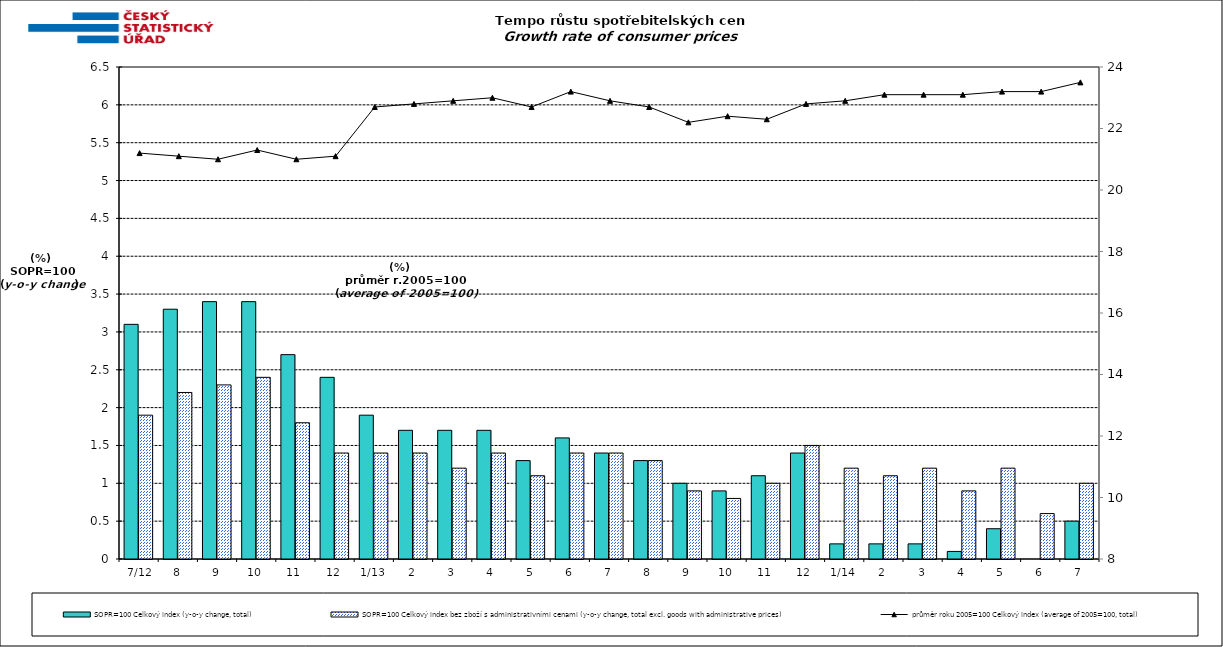
| Category | SOPR=100 Celkový index (y-o-y change, total) | SOPR=100 Celkový index bez zboží s administrativními cenami (y-o-y change, total excl. goods with administrative prices)  |
|---|---|---|
|  7/12 | 3.1 | 1.9 |
| 8 | 3.3 | 2.2 |
| 9 | 3.4 | 2.3 |
| 10 | 3.4 | 2.4 |
| 11 | 2.7 | 1.8 |
| 12 | 2.4 | 1.4 |
| 1/13 | 1.9 | 1.4 |
| 2 | 1.7 | 1.4 |
| 3 | 1.7 | 1.2 |
| 4 | 1.7 | 1.4 |
| 5 | 1.3 | 1.1 |
| 6 | 1.6 | 1.4 |
| 7 | 1.4 | 1.4 |
| 8 | 1.3 | 1.3 |
| 9 | 1 | 0.9 |
| 10 | 0.9 | 0.8 |
| 11 | 1.1 | 1 |
| 12 | 1.4 | 1.5 |
| 1/14 | 0.2 | 1.2 |
| 2 | 0.2 | 1.1 |
| 3 | 0.2 | 1.2 |
| 4 | 0.1 | 0.9 |
| 5 | 0.4 | 1.2 |
| 6 | 0 | 0.6 |
| 7 | 0.5 | 1 |